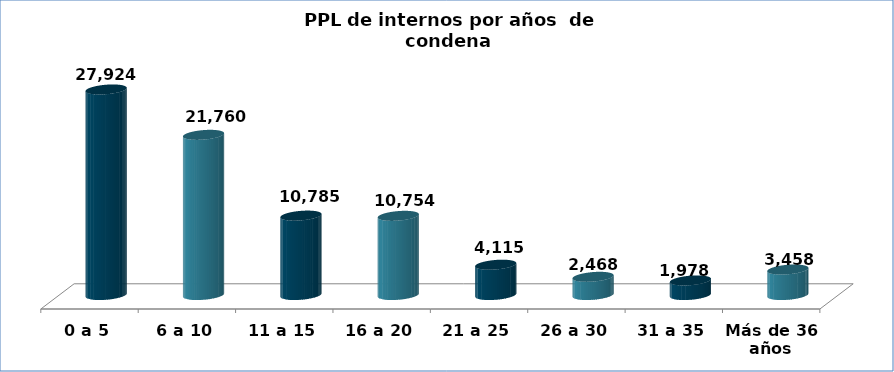
| Category | Series 0 |
|---|---|
| 0 a 5 | 27924 |
| 6 a 10 | 21760 |
| 11 a 15 | 10785 |
| 16 a 20 | 10754 |
| 21 a 25 | 4115 |
| 26 a 30 | 2468 |
| 31 a 35 | 1978 |
| Más de 36 años | 3458 |